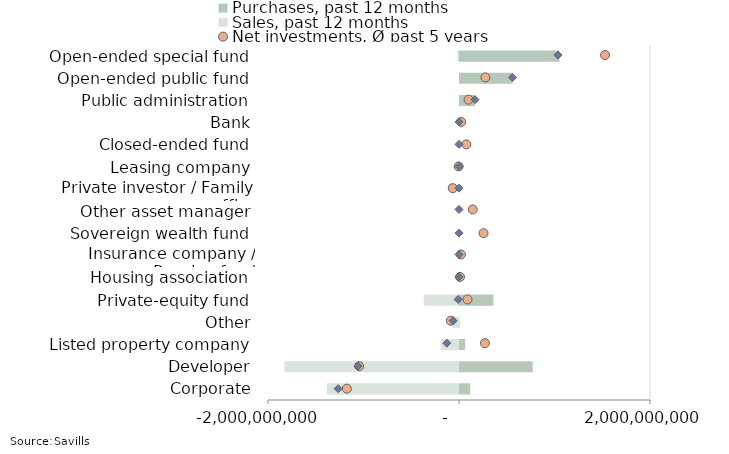
| Category | Purchases, past 12 months | Sales, past 12 months |
|---|---|---|
| Corporate | 118120831 | -1383422163 |
| Developer | 771378900 | -1828513627.95 |
| Listed property company | 64212000 | -191350400 |
| Other | 4999999 | -67198079 |
| Private-equity fund | 360465999 | -369408029.97 |
| Housing association | 0 | 0 |
| Insurance company / Pension fund | 0 | 0 |
| Sovereign wealth fund | 0 | 0 |
| Other asset manager | 0 | 0 |
| Private investor / Family office | 0 | 0 |
| Leasing company | 0 | 0 |
| Closed-ended fund | 0 | 0 |
| Bank | 0 | 0 |
| Public administration | 168159120 | -90000 |
| Open-ended public fund | 559999999.97 | 0 |
| Open-ended special fund | 1052163640.98 | -15649500 |